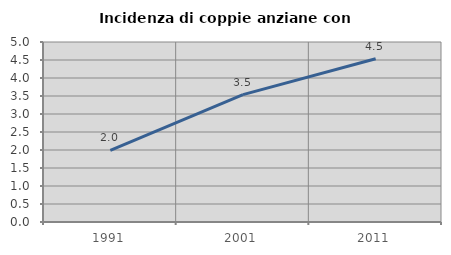
| Category | Incidenza di coppie anziane con figli |
|---|---|
| 1991.0 | 1.988 |
| 2001.0 | 3.537 |
| 2011.0 | 4.536 |